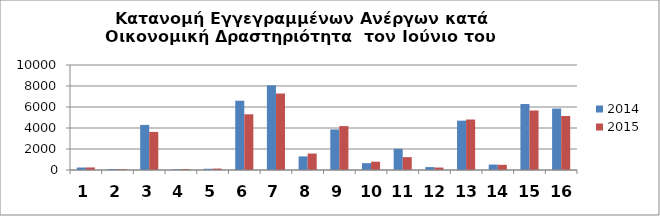
| Category | 2014 | 2015 |
|---|---|---|
| 0 | 236 | 244 |
| 1 | 97 | 73 |
| 2 | 4294 | 3628 |
| 3 | 63 | 88 |
| 4 | 116 | 137 |
| 5 | 6597 | 5305 |
| 6 | 8063 | 7284 |
| 7 | 1295 | 1568 |
| 8 | 3864 | 4183 |
| 9 | 651 | 791 |
| 10 | 2019 | 1226 |
| 11 | 277 | 235 |
| 12 | 4701 | 4807 |
| 13 | 520 | 493 |
| 14 | 6283 | 5668 |
| 15 | 5849 | 5146 |